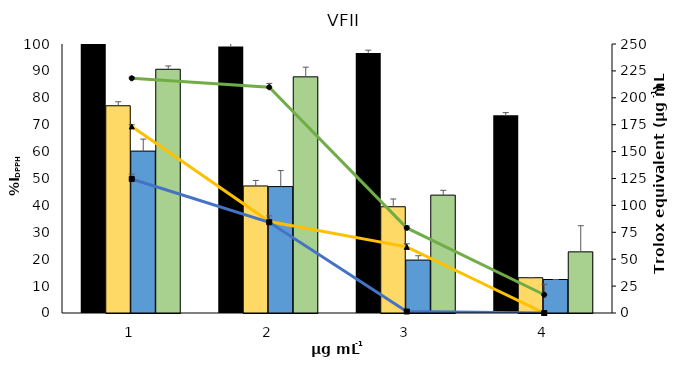
| Category | Trolox | Acetone | MeOH | EtOH 70% |
|---|---|---|---|---|
| 0 | 100 | 77.04 | 60.187 | 90.602 |
| 1 | 99.1 | 47.229 | 46.995 | 87.791 |
| 2 | 96.7 | 39.5 | 19.672 | 43.814 |
| 3 | 73.5 | 13.115 | 12.449 | 22.731 |